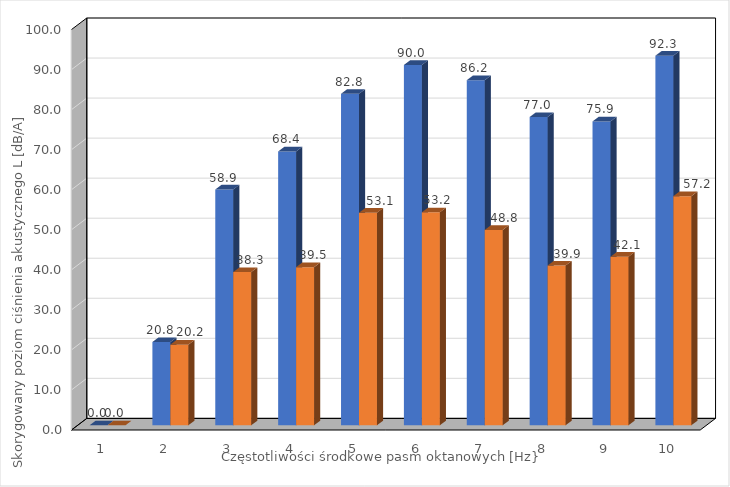
| Category | Series 0 | Series 1 |
|---|---|---|
| 0 | 0 | 0 |
| 1 | 20.8 | 20.154 |
| 2 | 58.9 | 38.275 |
| 3 | 68.4 | 39.506 |
| 4 | 82.8 | 53.088 |
| 5 | 90 | 53.2 |
| 6 | 86.2 | 48.8 |
| 7 | 77 | 39.9 |
| 8 | 75.9 | 42.1 |
| 9 | 92.315 | 57.244 |